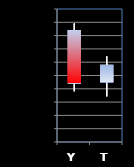
| Category | Series 0 | Series 1 | Series 2 | Series 3 |
|---|---|---|---|---|
| Y | 1604.2 | 1609.2 | 1558.1 | 1564 |
| T | 1564.8 | 1584.4 | 1554.3 | 1578 |